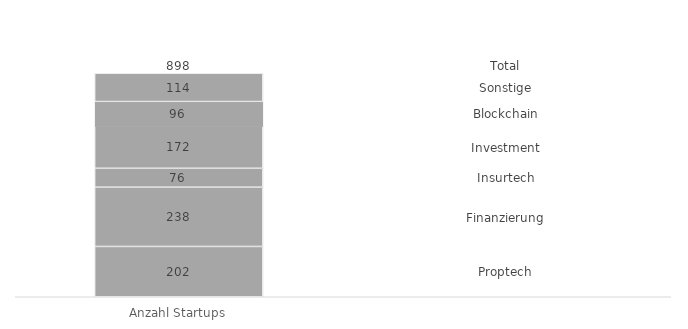
| Category | Proptech | Finanzierung | Insurtech | Investment | Blockchain | Sonstige | Total |
|---|---|---|---|---|---|---|---|
| Anzahl Startups | 202 | 238 | 76 | 172 | 96 | 114 | 0 |